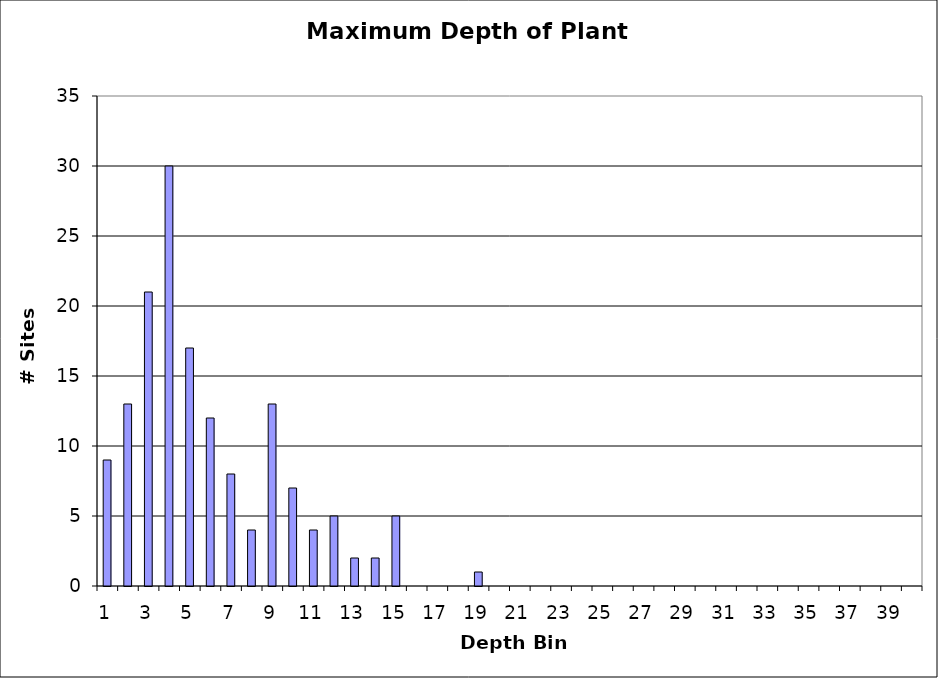
| Category | Series 0 |
|---|---|
| 1.0 | 9 |
| 2.0 | 13 |
| 3.0 | 21 |
| 4.0 | 30 |
| 5.0 | 17 |
| 6.0 | 12 |
| 7.0 | 8 |
| 8.0 | 4 |
| 9.0 | 13 |
| 10.0 | 7 |
| 11.0 | 4 |
| 12.0 | 5 |
| 13.0 | 2 |
| 14.0 | 2 |
| 15.0 | 5 |
| 16.0 | 0 |
| 17.0 | 0 |
| 18.0 | 0 |
| 19.0 | 1 |
| 20.0 | 0 |
| 21.0 | 0 |
| 22.0 | 0 |
| 23.0 | 0 |
| 24.0 | 0 |
| 25.0 | 0 |
| 26.0 | 0 |
| 27.0 | 0 |
| 28.0 | 0 |
| 29.0 | 0 |
| 30.0 | 0 |
| 31.0 | 0 |
| 32.0 | 0 |
| 33.0 | 0 |
| 34.0 | 0 |
| 35.0 | 0 |
| 36.0 | 0 |
| 37.0 | 0 |
| 38.0 | 0 |
| 39.0 | 0 |
| 40.0 | 0 |